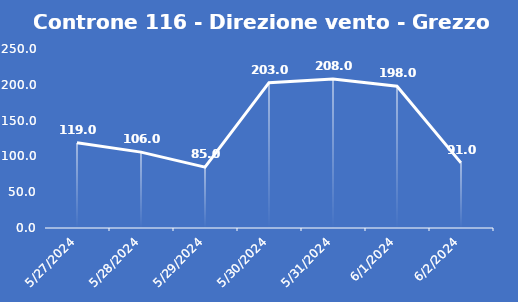
| Category | Controne 116 - Direzione vento - Grezzo (°N) |
|---|---|
| 5/27/24 | 119 |
| 5/28/24 | 106 |
| 5/29/24 | 85 |
| 5/30/24 | 203 |
| 5/31/24 | 208 |
| 6/1/24 | 198 |
| 6/2/24 | 91 |